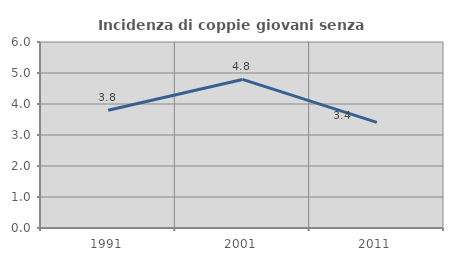
| Category | Incidenza di coppie giovani senza figli |
|---|---|
| 1991.0 | 3.799 |
| 2001.0 | 4.792 |
| 2011.0 | 3.408 |